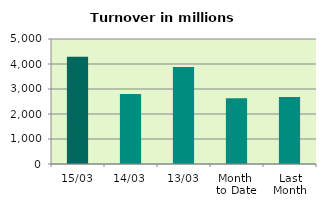
| Category | Series 0 |
|---|---|
| 15/03 | 4287.884 |
| 14/03 | 2803.088 |
| 13/03 | 3876.841 |
| Month 
to Date | 2625.57 |
| Last
Month | 2679.99 |